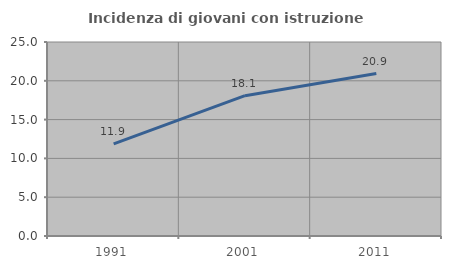
| Category | Incidenza di giovani con istruzione universitaria |
|---|---|
| 1991.0 | 11.881 |
| 2001.0 | 18.085 |
| 2011.0 | 20.93 |